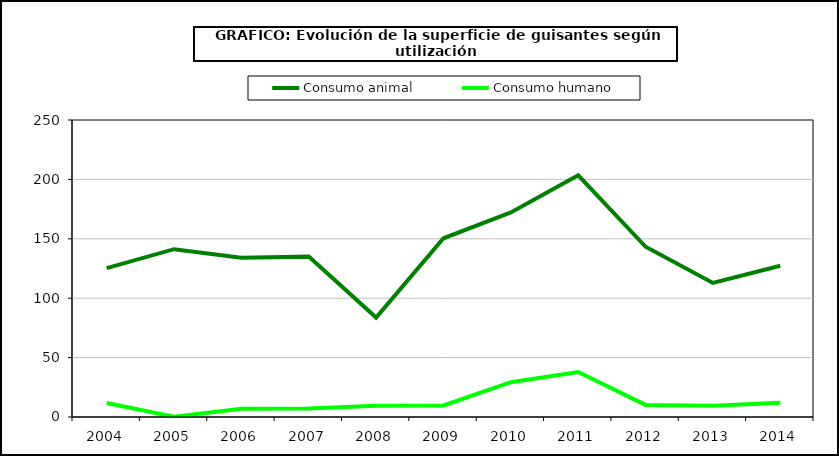
| Category | Consumo animal | Consumo humano |
|---|---|---|
| 2004.0 | 125.304 | 11.794 |
| 2005.0 | 141.256 | 0.222 |
| 2006.0 | 134.078 | 7.032 |
| 2007.0 | 134.99 | 7.209 |
| 2008.0 | 83.73 | 9.431 |
| 2009.0 | 150.442 | 9.731 |
| 2010.0 | 172.145 | 29.313 |
| 2011.0 | 203.446 | 37.901 |
| 2012.0 | 143.303 | 10.179 |
| 2013.0 | 112.865 | 9.381 |
| 2014.0 | 127.342 | 12.044 |